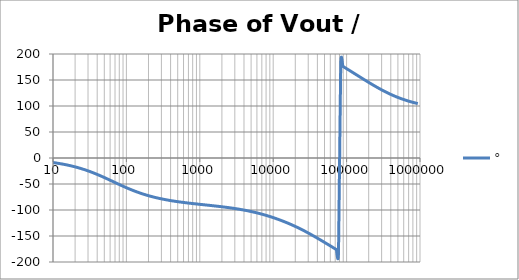
| Category | ° |
|---|---|
| 1.0 | -0.88 |
| 1.0715193052376064 | -0.942 |
| 1.1481536214968828 | -1.01 |
| 1.2302687708123814 | -1.082 |
| 1.318256738556407 | -1.159 |
| 1.4125375446227544 | -1.242 |
| 1.513561248436208 | -1.331 |
| 1.6218100973589298 | -1.426 |
| 1.7378008287493754 | -1.528 |
| 1.8620871366628673 | -1.637 |
| 1.9952623149688797 | -1.754 |
| 2.1379620895022318 | -1.88 |
| 2.2908676527677727 | -2.014 |
| 2.45470891568503 | -2.158 |
| 2.6302679918953817 | -2.312 |
| 2.8183829312644537 | -2.478 |
| 3.0199517204020156 | -2.654 |
| 3.235936569296282 | -2.844 |
| 3.467368504525316 | -3.047 |
| 3.7153522909717256 | -3.265 |
| 3.9810717055349727 | -3.497 |
| 4.265795188015926 | -3.747 |
| 4.570881896148749 | -4.014 |
| 4.897788193684462 | -4.3 |
| 5.2480746024977245 | -4.606 |
| 5.62341325190349 | -4.934 |
| 6.025595860743575 | -5.285 |
| 6.456542290346554 | -5.661 |
| 6.918309709189363 | -6.063 |
| 7.4131024130091765 | -6.493 |
| 7.943282347242814 | -6.953 |
| 8.511380382023765 | -7.445 |
| 9.120108393559095 | -7.971 |
| 9.772372209558105 | -8.533 |
| 10.47128548050899 | -9.133 |
| 11.22018454301963 | -9.774 |
| 12.022644346174127 | -10.459 |
| 12.88249551693134 | -11.189 |
| 13.803842646028851 | -11.967 |
| 14.791083881682074 | -12.795 |
| 15.848931924611136 | -13.678 |
| 16.98243652461744 | -14.616 |
| 18.197008586099834 | -15.612 |
| 19.498445997580447 | -16.669 |
| 20.892961308540382 | -17.789 |
| 22.387211385683386 | -18.974 |
| 23.988329190194897 | -20.225 |
| 25.703957827688622 | -21.544 |
| 27.54228703338165 | -22.932 |
| 29.51209226666385 | -24.388 |
| 31.62277660168379 | -25.912 |
| 33.884415613920254 | -27.504 |
| 36.307805477010106 | -29.16 |
| 38.90451449942804 | -30.877 |
| 41.686938347033525 | -32.653 |
| 44.6683592150963 | -34.481 |
| 47.86300923226381 | -36.356 |
| 51.28613839913647 | -38.271 |
| 54.95408738576247 | -40.218 |
| 58.88436553555889 | -42.189 |
| 63.09573444801931 | -44.174 |
| 67.60829753919813 | -46.166 |
| 72.44359600749901 | -48.153 |
| 77.62471166286915 | -50.128 |
| 83.17637711026705 | -52.081 |
| 89.12509381337456 | -54.004 |
| 95.49925860214357 | -55.888 |
| 102.32929922807544 | -57.728 |
| 109.64781961431841 | -59.517 |
| 117.48975549395293 | -61.251 |
| 125.89254117941665 | -62.925 |
| 134.89628825916537 | -64.537 |
| 144.54397707459273 | -66.083 |
| 154.88166189124806 | -67.565 |
| 165.95869074375608 | -68.98 |
| 177.82794100389225 | -70.329 |
| 190.5460717963248 | -71.613 |
| 204.17379446695278 | -72.833 |
| 218.77616239495524 | -73.992 |
| 234.42288153199212 | -75.091 |
| 251.18864315095806 | -76.132 |
| 269.15348039269156 | -77.119 |
| 288.4031503126605 | -78.054 |
| 309.0295432513591 | -78.94 |
| 331.1311214825911 | -79.779 |
| 354.81338923357566 | -80.575 |
| 380.18939632056095 | -81.329 |
| 407.3802778041123 | -82.047 |
| 436.5158322401654 | -82.728 |
| 467.7351412871979 | -83.378 |
| 501.18723362727184 | -83.998 |
| 537.0317963702526 | -84.591 |
| 575.4399373371566 | -85.159 |
| 616.5950018614822 | -85.705 |
| 660.6934480075952 | -86.232 |
| 707.9457843841375 | -86.741 |
| 758.5775750291831 | -87.235 |
| 812.8305161640983 | -87.716 |
| 870.9635899560801 | -88.186 |
| 933.2543007969903 | -88.649 |
| 999.9999999999998 | -89.104 |
| 1071.5193052376057 | -89.556 |
| 1148.1536214968828 | -90.005 |
| 1230.2687708123801 | -90.454 |
| 1318.2567385564053 | -90.905 |
| 1412.537544622753 | -91.36 |
| 1513.5612484362066 | -91.822 |
| 1621.8100973589292 | -92.291 |
| 1737.8008287493742 | -92.77 |
| 1862.0871366628671 | -93.262 |
| 1995.2623149688786 | -93.768 |
| 2137.9620895022326 | -94.291 |
| 2290.867652767771 | -94.832 |
| 2454.708915685027 | -95.395 |
| 2630.26799189538 | -95.98 |
| 2818.382931264451 | -96.591 |
| 3019.9517204020176 | -97.23 |
| 3235.9365692962774 | -97.898 |
| 3467.368504525316 | -98.599 |
| 3715.352290971724 | -99.334 |
| 3981.07170553497 | -100.105 |
| 4265.795188015923 | -100.915 |
| 4570.881896148745 | -101.765 |
| 4897.788193684463 | -102.657 |
| 5248.074602497726 | -103.593 |
| 5623.413251903489 | -104.575 |
| 6025.595860743574 | -105.604 |
| 6456.54229034655 | -106.68 |
| 6918.309709189357 | -107.806 |
| 7413.102413009165 | -108.981 |
| 7943.282347242815 | -110.206 |
| 8511.380382023763 | -111.481 |
| 9120.108393559092 | -112.807 |
| 9772.3722095581 | -114.184 |
| 10471.285480509003 | -115.612 |
| 11220.184543019639 | -117.091 |
| 12022.64434617411 | -118.622 |
| 12882.495516931338 | -120.206 |
| 13803.842646028841 | -121.843 |
| 14791.083881682063 | -123.535 |
| 15848.931924611119 | -125.282 |
| 16982.436524617453 | -127.087 |
| 18197.008586099837 | -128.95 |
| 19498.445997580417 | -130.872 |
| 20892.961308540387 | -132.854 |
| 22387.211385683382 | -134.896 |
| 23988.32919019488 | -136.998 |
| 25703.957827688606 | -139.158 |
| 27542.28703338167 | -141.374 |
| 29512.092266663854 | -143.643 |
| 31622.77660168378 | -145.962 |
| 33884.41561392023 | -148.325 |
| 36307.805477010166 | -150.73 |
| 38904.514499428085 | -153.17 |
| 41686.93834703348 | -155.64 |
| 44668.35921509631 | -158.137 |
| 47863.00923226382 | -160.654 |
| 51286.13839913646 | -163.19 |
| 54954.08738576241 | -165.739 |
| 58884.365535558936 | -168.299 |
| 63095.73444801934 | -170.869 |
| 67608.29753919817 | -173.447 |
| 72443.59600749899 | -176.032 |
| 77624.71166286913 | -178.625 |
| 83176.37711026703 | 178.776 |
| 89125.09381337445 | 176.168 |
| 95499.25860214363 | 173.554 |
| 102329.29922807543 | 170.931 |
| 109647.81961431848 | 168.3 |
| 117489.75549395289 | 165.663 |
| 125892.54117941685 | 163.019 |
| 134896.28825916522 | 160.372 |
| 144543.97707459255 | 157.725 |
| 154881.66189124787 | 155.08 |
| 165958.69074375575 | 152.444 |
| 177827.9410038922 | 149.82 |
| 190546.07179632425 | 147.217 |
| 204173.79446695274 | 144.639 |
| 218776.16239495497 | 142.094 |
| 234422.88153199226 | 139.59 |
| 251188.64315095753 | 137.134 |
| 269153.480392691 | 134.733 |
| 288403.15031266044 | 132.393 |
| 309029.5432513582 | 130.12 |
| 331131.1214825907 | 127.92 |
| 354813.3892335749 | 125.797 |
| 380189.3963205612 | 123.754 |
| 407380.2778041119 | 121.794 |
| 436515.8322401649 | 119.918 |
| 467735.14128719777 | 118.128 |
| 501187.2336272717 | 116.424 |
| 537031.7963702519 | 114.804 |
| 575439.9373371559 | 113.269 |
| 616595.001861482 | 111.815 |
| 660693.4480075944 | 110.441 |
| 707945.7843841374 | 109.145 |
| 758577.575029183 | 107.923 |
| 812830.5161640996 | 106.773 |
| 870963.5899560791 | 105.691 |
| 933254.3007969892 | 104.675 |